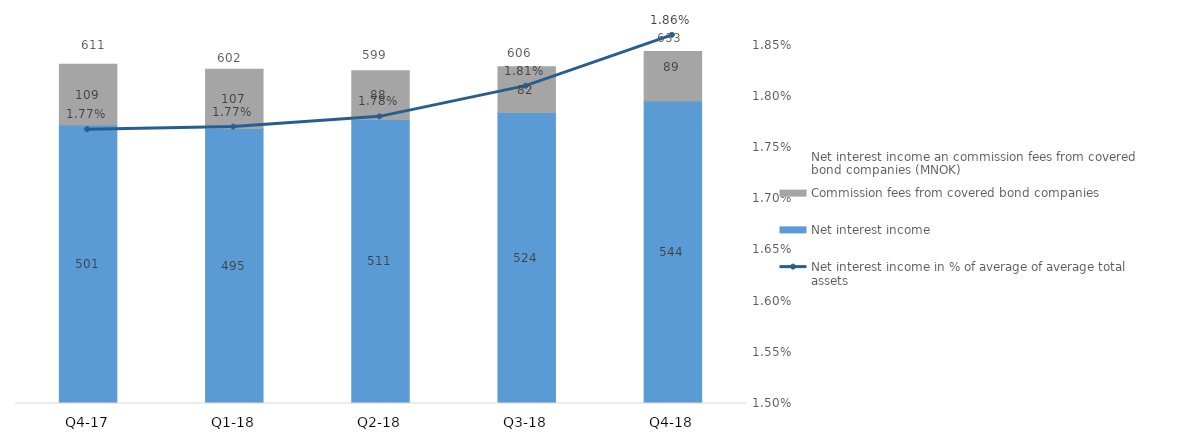
| Category | Net interest income | Commission fees from covered bond companies |
|---|---|---|
| Q4-18 | 544.319 | 88.946 |
| Q3-18 | 523.87 | 81.9 |
| Q2-18 | 511.1 | 87.5 |
| Q1-18 | 495 | 106.7 |
| Q4-17 | 501.2 | 109.3 |